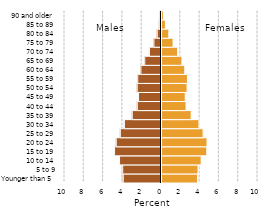
| Category | Female |
|---|---|
| Younger than 5 | 3.742 |
| 5 to 9 | 3.784 |
| 10 to 14 | 4.109 |
| 15 to 19 | 4.69 |
| 20 to 24 | 4.717 |
| 25 to 29 | 4.311 |
| 30 to 34 | 3.883 |
| 35 to 39 | 3.072 |
| 40 to 44 | 2.546 |
| 45 to 49 | 2.459 |
| 50 to 54 | 2.652 |
| 55 to 59 | 2.688 |
| 60 to 64 | 2.411 |
| 65 to 69 | 2.117 |
| 70 to 74 | 1.669 |
| 75 to 79 | 1.198 |
| 80 to 84 | 0.762 |
| 85 to 89 | 0.402 |
| 90 and older | 0.193 |